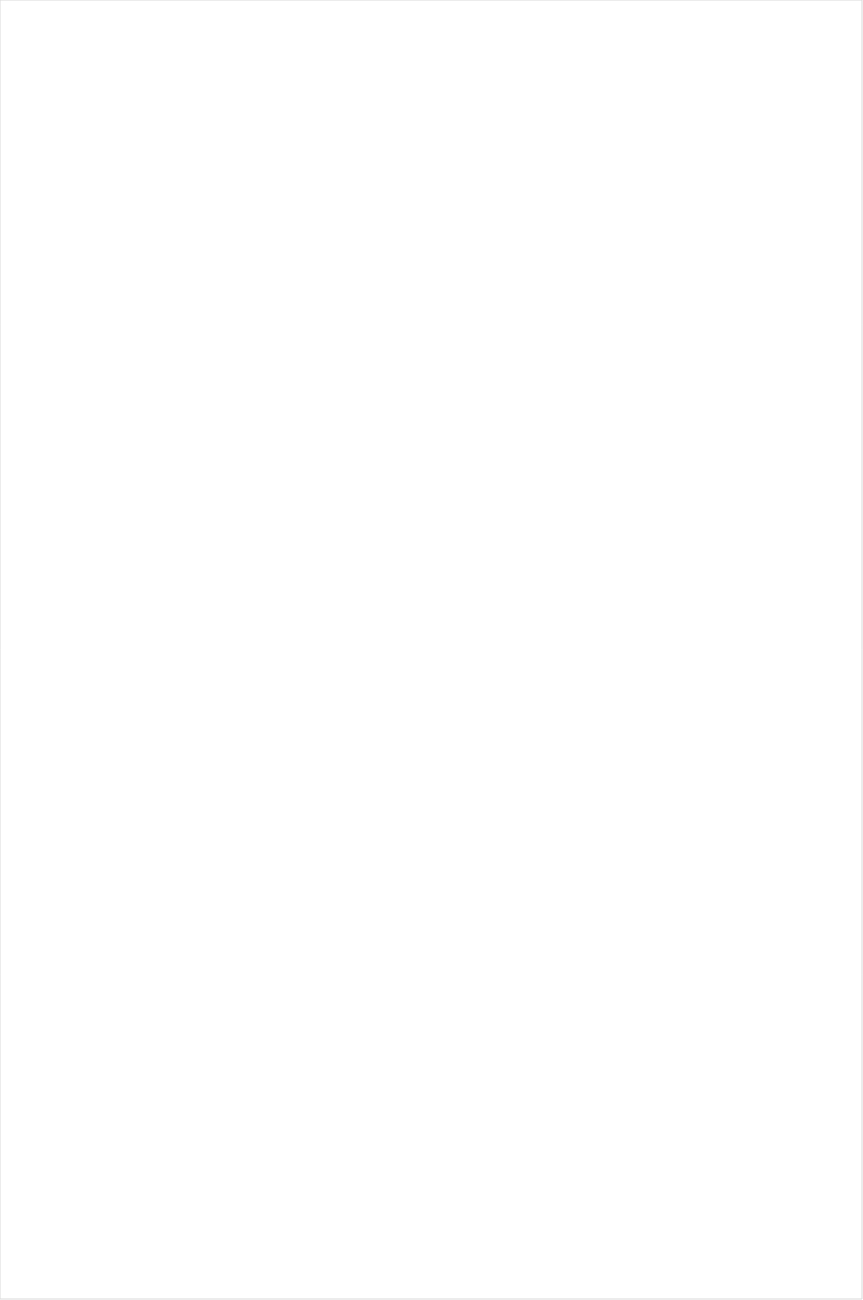
| Category | Total |
|---|---|
| BET Her | -0.589 |
| BET | -0.536 |
| VH1 | -0.508 |
| Lifetime Movies | -0.492 |
| Cartoon Network | -0.403 |
| TV ONE | -0.399 |
| MTV2 | -0.349 |
| Logo | -0.34 |
| UniMas | -0.329 |
| Oprah Winfrey Network | -0.311 |
| Nick | -0.3 |
| TLC | -0.294 |
| Disney Channel | -0.274 |
| Univision | -0.271 |
| Nick Toons | -0.27 |
| Universal Kids | -0.261 |
| WE TV | -0.255 |
| Adult Swim | -0.244 |
| Lifetime | -0.242 |
| UP TV | -0.23 |
| Telemundo | -0.23 |
| NBC Universo | -0.22 |
| Nick Jr. | -0.216 |
| Travel | -0.212 |
| Galavision | -0.196 |
| Investigation Discovery | -0.186 |
| MyNetworkTV | -0.177 |
| Disney XD | -0.177 |
| Hallmark | -0.175 |
| ION | -0.166 |
| Hallmark Movies & Mysteries | -0.163 |
| Discovery Life Channel | -0.152 |
| TUDN | -0.146 |
| CW | -0.126 |
| Teen Nick | -0.122 |
| Science Channel | -0.103 |
| Disney Junior US | -0.103 |
| BRAVO | -0.078 |
| OXYGEN | -0.066 |
| POP | -0.05 |
| Nick@Nite | -0.041 |
| CMTV | -0.04 |
| E! | -0.025 |
| PBS | -0.014 |
| A&E | -0.005 |
| Headline News | -0.001 |
| Discovery Family Channel | 0.004 |
| Motor Trend Network | 0.016 |
| Discovery Channel | 0.017 |
| NBC | 0.033 |
| HGTV | 0.037 |
| Great American Country | 0.039 |
| CBS | 0.048 |
| SYFY | 0.053 |
| INSP | 0.06 |
| MTV | 0.07 |
| ABC | 0.072 |
| Animal Planet | 0.073 |
| MSNBC | 0.085 |
| FX Movie Channel | 0.101 |
| FX | 0.115 |
| USA Network | 0.12 |
| FXX | 0.127 |
| National Geographic Wild | 0.135 |
| Freeform | 0.143 |
| History Channel | 0.15 |
| Weather Channel | 0.182 |
| CNN | 0.209 |
| TBS | 0.217 |
| Ovation | 0.229 |
| FYI | 0.236 |
| Food Network | 0.24 |
| AMC | 0.241 |
| Paramount Network | 0.25 |
| National Geographic | 0.256 |
| TV LAND | 0.258 |
| DIY | 0.283 |
| TNT | 0.296 |
| Cooking Channel | 0.298 |
| FOX | 0.303 |
| Destination America | 0.316 |
| Reelz Channel | 0.318 |
| BBC America | 0.33 |
| WGN America | 0.333 |
| SundanceTV | 0.337 |
| truTV | 0.353 |
| Viceland | 0.363 |
| Fox Business | 0.37 |
| RFD TV | 0.374 |
| Fox News | 0.381 |
| Smithsonian | 0.421 |
| Comedy Central | 0.431 |
| CNBC | 0.435 |
| Game Show | 0.438 |
| American Heroes Channel | 0.458 |
| Outdoor Channel | 0.488 |
| Independent Film (IFC) | 0.538 |
| Bloomberg HD | 0.554 |
| The Sportsman Channel | 0.769 |
| Tennis Channel | 0.917 |
| FXDEP | 1.208 |
| FOX Sports 2 | 1.226 |
| Olympic Channel | 1.229 |
| Fox Sports 1 | 1.41 |
| NBA TV | 1.485 |
| NBC Sports | 1.489 |
| CBS Sports | 1.542 |
| NFL Network | 1.577 |
| Big Ten Network | 1.672 |
| ESPNEWS | 2.039 |
| Golf | 2.158 |
| ESPN | 2.463 |
| PAC-12 Network | 2.514 |
| ESPN2 | 2.716 |
| ESPN Deportes | 2.996 |
| NHL | 3.006 |
| ESPNU | 3.408 |
| MLB Network | 6.365 |